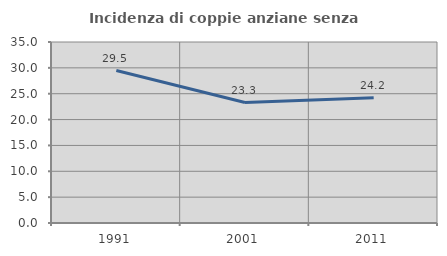
| Category | Incidenza di coppie anziane senza figli  |
|---|---|
| 1991.0 | 29.487 |
| 2001.0 | 23.288 |
| 2011.0 | 24.242 |